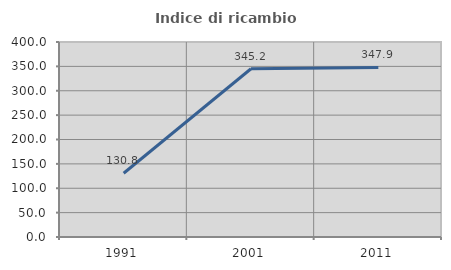
| Category | Indice di ricambio occupazionale  |
|---|---|
| 1991.0 | 130.833 |
| 2001.0 | 345.161 |
| 2011.0 | 347.917 |